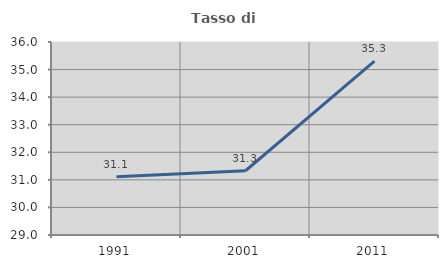
| Category | Tasso di occupazione   |
|---|---|
| 1991.0 | 31.111 |
| 2001.0 | 31.33 |
| 2011.0 | 35.309 |